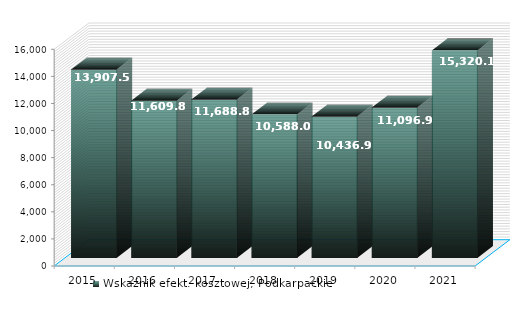
| Category | Wskaźnik efekt. kosztowej, Podkarpackie |
|---|---|
| 2015.0 | 13907.53 |
| 2016.0 | 11609.894 |
| 2017.0 | 11688.894 |
| 2018.0 | 10588.083 |
| 2019.0 | 10436.922 |
| 2020.0 | 11096.926 |
| 2021.0 | 15320.116 |